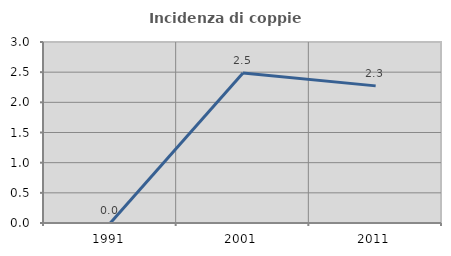
| Category | Incidenza di coppie miste |
|---|---|
| 1991.0 | 0 |
| 2001.0 | 2.484 |
| 2011.0 | 2.273 |